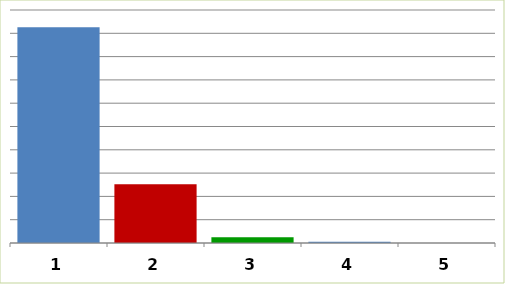
| Category | Series 0 |
|---|---|
| 0 | 185211022.5 |
| 1 | 50441185 |
| 2 | 4833032 |
| 3 | 1123668 |
| 4 | 0 |